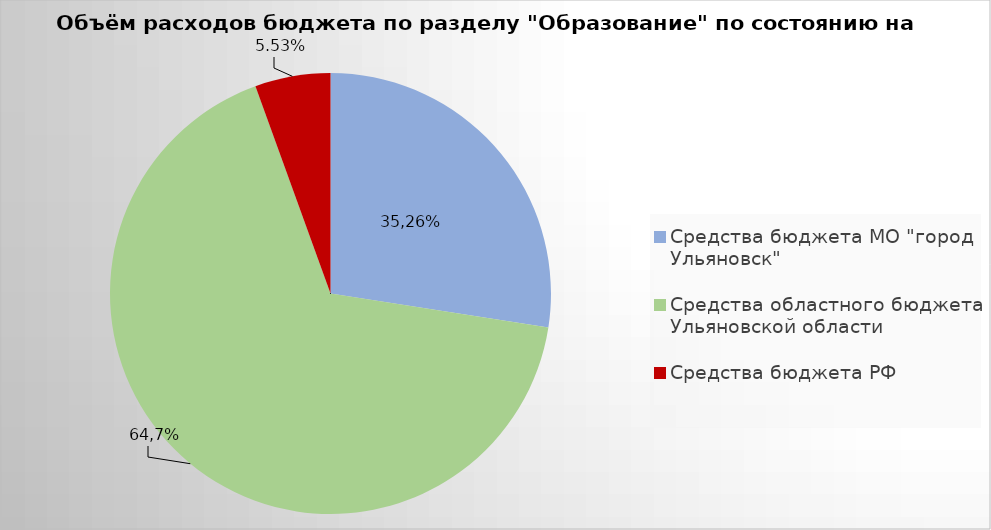
| Category | Series 0 |
|---|---|
| Средства бюджета МО "город Ульяновск" | 2131949.6 |
| Средства областного бюджета Ульяновской области | 5203383.88 |
| Средства бюджета РФ | 429251.77 |